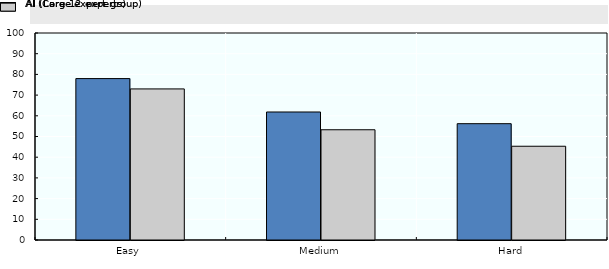
| Category | AI (Core 12 experts) | AI (Large expert group) |
|---|---|---|
| Easy | 77.98 | 72.99 |
| Medium | 61.84 | 53.26 |
| Hard | 56.19 | 45.29 |